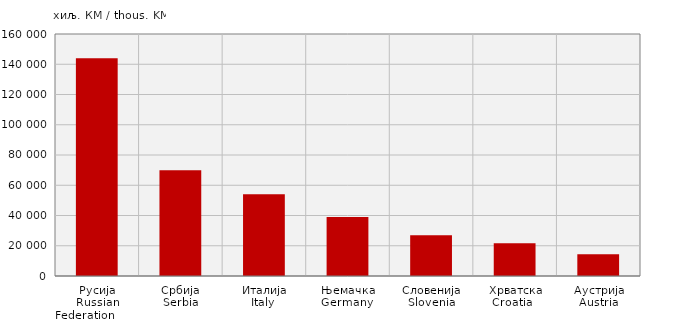
| Category | Увоз
Import |
|---|---|
| Русија
Russian Federation               | 144039 |
| Србија
Serbia | 69885 |
| Италија
Italy  | 54125 |
| Њемачка
Germany  | 39090 |
| Словенија
Slovenia | 26904 |
| Хрватска
Croatia   | 21641 |
| Аустрија
Austria | 14462 |